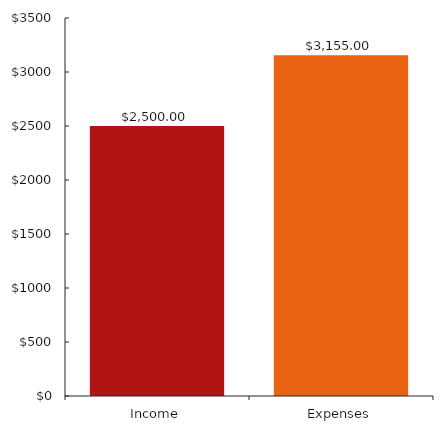
| Category | ChartData |
|---|---|
| 0 | 2500 |
| 1 | 3155 |